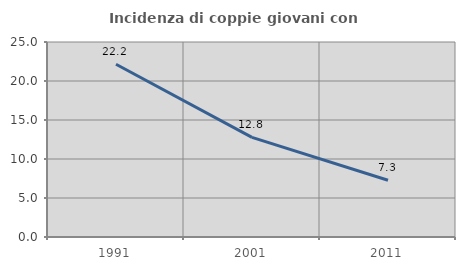
| Category | Incidenza di coppie giovani con figli |
|---|---|
| 1991.0 | 22.154 |
| 2001.0 | 12.766 |
| 2011.0 | 7.271 |